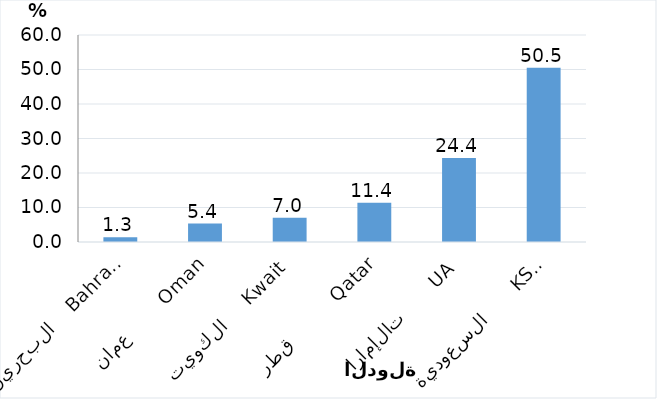
| Category | Series 0 |
|---|---|
| السعودية       KSA      | 50.51 |
| الإمارات       UAE | 24.383 |
| قطر          Qatar | 11.395 |
| الكويت     Kwait | 7.011 |
| عمان        Oman | 5.358 |
| البحرين    Bahrain | 1.343 |